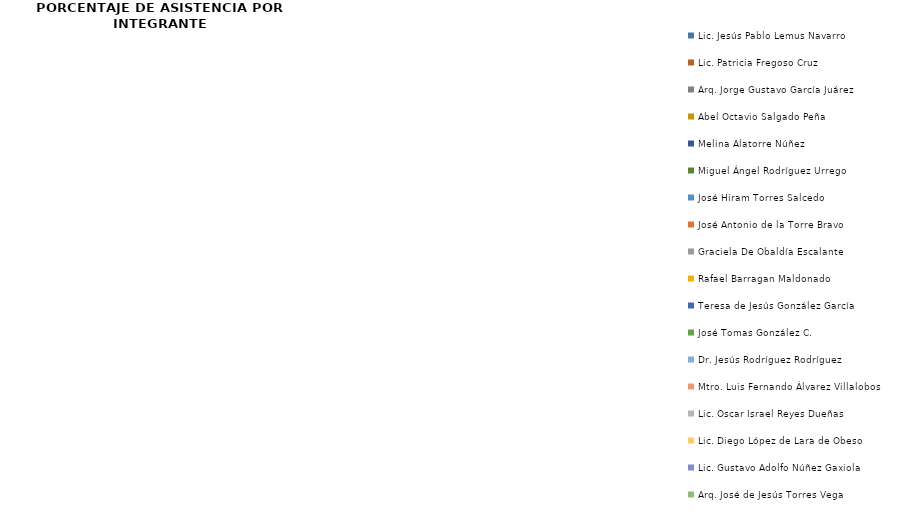
| Category | Series 0 |
|---|---|
| Lic. Jesús Pablo Lemus Navarro | 0 |
| Lic. Patricia Fregoso Cruz | 0 |
| Arq. Jorge Gustavo García Juárez | 0 |
| Abel Octavio Salgado Peña | 0 |
| Melina Alatorre Núñez | 0 |
| Miguel Ángel Rodríguez Urrego | 0 |
| José Hiram Torres Salcedo | 0 |
| José Antonio de la Torre Bravo | 0 |
| Graciela De Obaldía Escalante | 0 |
| Rafael Barragan Maldonado | 0 |
| Teresa de Jesús González García | 0 |
| José Tomas González C. | 0 |
| Dr. Jesús Rodríguez Rodríguez | 0 |
| Mtro. Luis Fernando Álvarez Villalobos | 0 |
| Lic. Oscar Israel Reyes Dueñas | 0 |
| Lic. Diego López de Lara de Obeso | 0 |
| Lic. Gustavo Adolfo Núñez Gaxiola | 0 |
| Arq. José de Jesús Torres Vega | 0 |